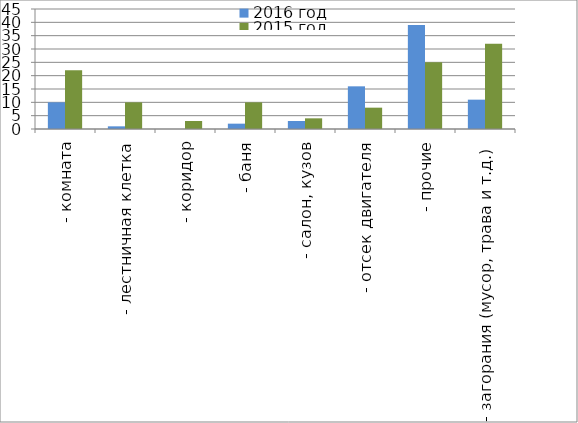
| Category | 2016 год | 2015 год |
|---|---|---|
|  - комната | 10 | 22 |
|  - лестничная клетка | 1 | 10 |
|  - коридор | 0 | 3 |
|  - баня | 2 | 10 |
|  - салон, кузов | 3 | 4 |
|  - отсек двигателя | 16 | 8 |
| - прочие | 39 | 25 |
| - загорания (мусор, трава и т.д.)  | 11 | 32 |